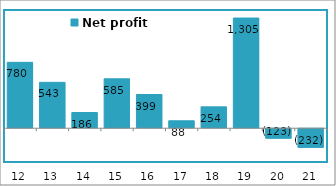
| Category | Net profit |
|---|---|
| 2012-03-31 | 780.05 |
| 2013-03-31 | 543.36 |
| 2014-03-31 | 186.1 |
| 2015-03-31 | 585.27 |
| 2016-03-31 | 399.32 |
| 2017-03-31 | 88.12 |
| 2018-03-31 | 253.51 |
| 2019-03-31 | 1304.89 |
| 2020-03-31 | -123.38 |
| 2021-03-31 | -231.72 |